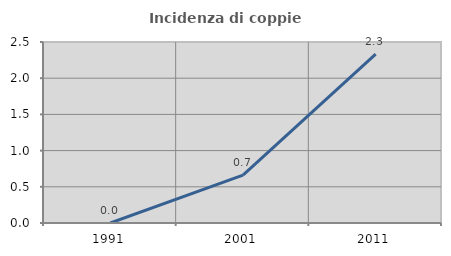
| Category | Incidenza di coppie miste |
|---|---|
| 1991.0 | 0 |
| 2001.0 | 0.66 |
| 2011.0 | 2.333 |